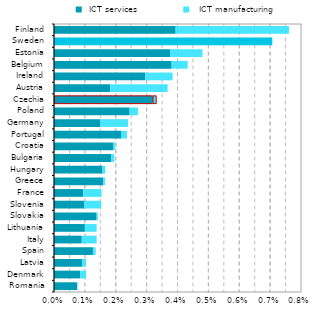
| Category |  ICT services  |   ICT manufacturing |
|---|---|---|
| Romania | 0.001 | 0 |
| Denmark | 0.001 | 0 |
| Latvia | 0.001 | 0 |
| Spain | 0.001 | 0 |
| Italy | 0.001 | 0 |
| Lithuania | 0.001 | 0 |
| Slovakia | 0.001 | 0 |
| Slovenia | 0.001 | 0.001 |
| France | 0.001 | 0.001 |
| Greece | 0.002 | 0 |
| Hungary | 0.002 | 0 |
| Bulgaria | 0.002 | 0 |
| Croatia | 0.002 | 0 |
| Portugal | 0.002 | 0 |
| Germany | 0.002 | 0.001 |
| Poland | 0.002 | 0 |
| Czechia | 0.003 | 0 |
| Austria | 0.002 | 0.002 |
| Ireland | 0.003 | 0.001 |
| Belgium | 0.004 | 0.001 |
| Estonia | 0.004 | 0.001 |
| Sweden | 0.007 | 0 |
| Finland | 0.004 | 0.004 |